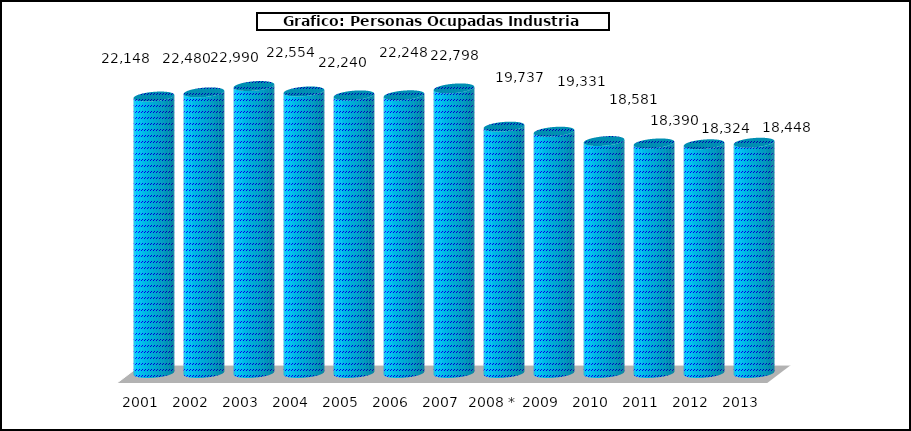
| Category |  Personas Ocupadas Industria Pesquera |
|---|---|
| 2001 | 22148 |
| 2002 | 22480 |
| 2003 | 22990 |
| 2004 | 22554 |
| 2005 | 22240 |
| 2006 | 22248 |
| 2007 | 22798 |
| 2008 * | 19737 |
| 2009 | 19331 |
| 2010 | 18581 |
| 2011 | 18390 |
| 2012 | 18324 |
| 2013 | 18448 |